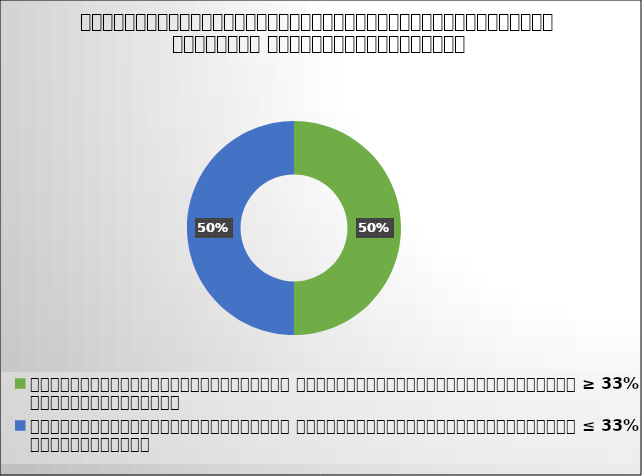
| Category | Series 0 |
|---|---|
| ផលចែករវាងមូលដ្ឋានសុខាភិបាល និងទិន្នន័យនៅស្រុកប្រតិបត្តិ ≥ 33% មិនអាចទទួលយកបាន | 50 |
| ផលចែករវាងមូលដ្ឋានសុខាភិបាល និងទិន្នន័យនៅស្រុកប្រតិបត្តិ ≤ 33% អាចទទួលយកបាន | 50 |